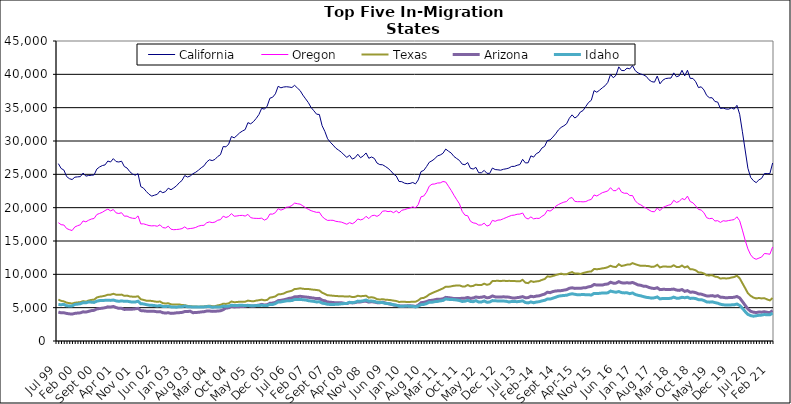
| Category | California | Oregon | Texas | Arizona | Idaho |
|---|---|---|---|---|---|
| Jul 99 | 26605 | 17749 | 6209 | 4339 | 5471 |
| Aug 99 | 25882 | 17447 | 6022 | 4228 | 5444 |
| Sep 99 | 25644 | 17401 | 5941 | 4237 | 5488 |
| Oct 99 | 24669 | 16875 | 5751 | 4134 | 5279 |
| Nov 99 | 24353 | 16701 | 5680 | 4073 | 5260 |
| Dec 99 | 24218 | 16570 | 5619 | 4042 | 5269 |
| Jan 00 | 24574 | 17109 | 5736 | 4142 | 5485 |
| Feb 00 | 24620 | 17295 | 5789 | 4192 | 5530 |
| Mar 00 | 24655 | 17436 | 5826 | 4226 | 5590 |
| Apr 00 | 25195 | 18009 | 5980 | 4375 | 5748 |
| May 00 | 24730 | 17875 | 5897 | 4337 | 5729 |
| Jun 00 | 24825 | 18113 | 6070 | 4444 | 5853 |
| Jul 00 | 24857 | 18294 | 6163 | 4555 | 5824 |
| Aug 00 | 24913 | 18376 | 6199 | 4603 | 5788 |
| Sep 00 | 25792 | 18971 | 6529 | 4804 | 5976 |
| Oct 00 | 26106 | 19135 | 6643 | 4870 | 6058 |
| Nov 00 | 26315 | 19306 | 6705 | 4926 | 6085 |
| Dec 00 | 26415 | 19570 | 6793 | 4991 | 6096 |
| Jan 01 | 26995 | 19781 | 6942 | 5122 | 6119 |
| Feb 01 | 26851 | 19519 | 6948 | 5089 | 6090 |
| Mar 01 | 27352 | 19720 | 7080 | 5180 | 6143 |
| Apr 01 | 26918 | 19221 | 6943 | 5020 | 6020 |
| May 01 | 26848 | 19126 | 6924 | 4899 | 5950 |
| Jun 01 | 26974 | 19241 | 6959 | 4895 | 6019 |
| Jul 01 | 26172 | 18725 | 6778 | 4737 | 5951 |
| Aug 01 | 25943 | 18736 | 6810 | 4757 | 5973 |
| Sep 01 | 25399 | 18514 | 6688 | 4753 | 5895 |
| Oct 01 | 25050 | 18415 | 6650 | 4780 | 5833 |
| Nov 01 | 24873 | 18381 | 6631 | 4826 | 5850 |
| Dec 01 | 25099 | 18765 | 6708 | 4898 | 5969 |
| Jan 02 | 23158 | 17561 | 6261 | 4560 | 5595 |
| Feb 02 | 22926 | 17573 | 6162 | 4531 | 5560 |
| Mar 02 | 22433 | 17452 | 6052 | 4481 | 5458 |
| Apr 02 | 22012 | 17314 | 6046 | 4458 | 5380 |
| May 02 | 21733 | 17267 | 6007 | 4452 | 5358 |
| Jun 02 | 21876 | 17298 | 5933 | 4444 | 5315 |
| Jul 02 | 21997 | 17209 | 5873 | 4383 | 5243 |
| Aug 02 | 22507 | 17436 | 5929 | 4407 | 5315 |
| Sep 02 | 22244 | 17010 | 5672 | 4248 | 5192 |
| Oct 02 | 22406 | 16952 | 5625 | 4191 | 5167 |
| Nov 02 | 22922 | 17223 | 5663 | 4242 | 5221 |
| Dec 02 | 22693 | 16770 | 5499 | 4142 | 5120 |
| Jan 03 | 22964 | 16694 | 5463 | 4166 | 5089 |
| Feb 03 | 23276 | 16727 | 5461 | 4226 | 5077 |
| Mar 03 | 23736 | 16766 | 5486 | 4251 | 5145 |
| Apr 03 | 24079 | 16859 | 5389 | 4289 | 5145 |
| May 03 | 24821 | 17117 | 5378 | 4415 | 5254 |
| Jun 03 | 24592 | 16812 | 5273 | 4426 | 5135 |
| Jul 03 | 24754 | 16875 | 5226 | 4466 | 5124 |
| Aug 03 | 25092 | 16922 | 5181 | 4244 | 5100 |
| Sep 03 | 25316 | 17036 | 5181 | 4279 | 5086 |
| Oct 03 | 25622 | 17228 | 5139 | 4301 | 5110 |
| Nov 03 | 25984 | 17335 | 5175 | 4362 | 5091 |
| Dec 03 | 26269 | 17350 | 5189 | 4396 | 5113 |
| Jan 04 | 26852 | 17734 | 5255 | 4492 | 5152 |
| Feb 04 | 27184 | 17860 | 5301 | 4502 | 5183 |
| Mar 04 | 27062 | 17757 | 5227 | 4443 | 5056 |
| Apr 04 | 27238 | 17840 | 5227 | 4461 | 5104 |
| May 04 | 27671 | 18113 | 5345 | 4493 | 5095 |
| Jun 04 | 27949 | 18201 | 5416 | 4532 | 5103 |
| Jul 04 | 29172 | 18727 | 5597 | 4697 | 5231 |
| Aug 04 | 29122 | 18529 | 5561 | 4945 | 5197 |
| Sep 04 | 29542 | 18678 | 5656 | 4976 | 5237 |
| Oct 04 | 30674 | 19108 | 5922 | 5188 | 5363 |
| Nov 04 | 30472 | 18716 | 5823 | 5106 | 5321 |
| Dec 04 | 30831 | 18755 | 5838 | 5135 | 5312 |
| Jan 05 | 31224 | 18823 | 5906 | 5155 | 5374 |
| Feb 05 | 31495 | 18842 | 5898 | 5168 | 5357 |
| Mar 05 | 31714 | 18738 | 5894 | 5212 | 5313 |
| Apr 05 | 32750 | 18998 | 6060 | 5340 | 5350 |
| May 05 | 32575 | 18504 | 5989 | 5269 | 5276 |
| Jun 05 | 32898 | 18414 | 5954 | 5252 | 5271 |
| Jul 05 | 33384 | 18395 | 6062 | 5322 | 5322 |
| Aug 05 | 33964 | 18381 | 6113 | 5375 | 5316 |
| Sep 05 | 34897 | 18426 | 6206 | 5493 | 5362 |
| Oct 05 | 34780 | 18132 | 6100 | 5408 | 5308 |
| Nov 05 | 35223 | 18332 | 6162 | 5434 | 5314 |
| Dec 05 | 36415 | 19047 | 6508 | 5658 | 5487 |
| Jan 06 | 36567 | 19032 | 6576 | 5688 | 5480 |
| Feb 06 | 37074 | 19257 | 6692 | 5792 | 5616 |
| Mar 06 | 38207 | 19845 | 6993 | 6052 | 5850 |
| Apr 06 | 37976 | 19637 | 7024 | 6101 | 5864 |
| May 06 | 38099 | 19781 | 7114 | 6178 | 5943 |
| Jun 06 | 38141 | 20061 | 7331 | 6276 | 6018 |
| Jul 06 | 38097 | 20111 | 7431 | 6399 | 6046 |
| Aug 06 | 38021 | 20333 | 7542 | 6450 | 6064 |
| Sep 06 | 38349 | 20686 | 7798 | 6627 | 6232 |
| Oct 06 | 37947 | 20591 | 7825 | 6647 | 6216 |
| Nov 06 | 37565 | 20526 | 7907 | 6707 | 6244 |
| Dec 06 | 36884 | 20272 | 7840 | 6648 | 6192 |
| Jan 07 | 36321 | 19984 | 7789 | 6597 | 6151 |
| Feb 07 | 35752 | 19752 | 7799 | 6554 | 6048 |
| Mar 07 | 35025 | 19547 | 7737 | 6487 | 5989 |
| Apr 07 | 34534 | 19412 | 7685 | 6430 | 5937 |
| May 07 | 34022 | 19296 | 7654 | 6353 | 5858 |
| Jun 07 | 33974 | 19318 | 7577 | 6390 | 5886 |
| Jul 07 | 32298 | 18677 | 7250 | 6117 | 5682 |
| Aug 07 | 31436 | 18322 | 7070 | 6034 | 5617 |
| Sep 07 | 30331 | 18087 | 6853 | 5847 | 5500 |
| Oct 07 | 29813 | 18108 | 6839 | 5821 | 5489 |
| Nov 07 | 29384 | 18105 | 6777 | 5769 | 5481 |
| Dec 07 | 28923 | 17949 | 6760 | 5733 | 5499 |
| Jan 08 | 28627 | 17890 | 6721 | 5732 | 5521 |
| Feb 08 | 28328 | 17834 | 6719 | 5749 | 5579 |
| Mar 08 | 27911 | 17680 | 6690 | 5650 | 5614 |
| Apr 08 | 27543 | 17512 | 6656 | 5612 | 5635 |
| May 08 | 27856 | 17754 | 6705 | 5774 | 5798 |
| Jun 08 | 27287 | 17589 | 6593 | 5717 | 5745 |
| Jul 08 | 27495 | 17834 | 6623 | 5761 | 5807 |
| Aug 08 | 28018 | 18309 | 6789 | 5867 | 5982 |
| Sep-08 | 27491 | 18164 | 6708 | 5864 | 5954 |
| Oct 08 | 27771 | 18291 | 6755 | 5942 | 6032 |
| Nov 08 | 28206 | 18706 | 6787 | 5970 | 6150 |
| Dec 08 | 27408 | 18353 | 6505 | 5832 | 5975 |
| Jan 09 | 27601 | 18778 | 6569 | 5890 | 5995 |
| Feb 09 | 27394 | 18863 | 6483 | 5845 | 5936 |
| Mar 09 | 26690 | 18694 | 6273 | 5751 | 5806 |
| Apr 09 | 26461 | 18943 | 6222 | 5735 | 5777 |
| May 09 | 26435 | 19470 | 6272 | 5819 | 5767 |
| Jun 09 | 26187 | 19522 | 6199 | 5700 | 5649 |
| Jul 09 | 25906 | 19408 | 6171 | 5603 | 5617 |
| Aug 09 | 25525 | 19469 | 6128 | 5533 | 5540 |
| Sep 09 | 25050 | 19249 | 6059 | 5405 | 5437 |
| Oct 09 | 24741 | 19529 | 6004 | 5349 | 5369 |
| Nov 09 | 23928 | 19187 | 5854 | 5271 | 5248 |
| Dec 09 | 23899 | 19607 | 5886 | 5261 | 5195 |
| Jan 10 | 23676 | 19703 | 5881 | 5232 | 5234 |
| Feb 10 | 23592 | 19845 | 5850 | 5272 | 5236 |
| Mar 10 | 23634 | 19946 | 5864 | 5278 | 5219 |
| Apr 10 | 23774 | 20134 | 5889 | 5257 | 5201 |
| May 10 | 23567 | 19966 | 5897 | 5172 | 5105 |
| Jun 10 | 24166 | 20464 | 6087 | 5356 | 5237 |
| Jul 10 | 25410 | 21627 | 6417 | 5742 | 5452 |
| Aug 10 | 25586 | 21744 | 6465 | 5797 | 5491 |
| Sep 10 | 26150 | 22314 | 6667 | 5907 | 5609 |
| Oct 10 | 26807 | 23219 | 6986 | 6070 | 5831 |
| Nov 10 | 27033 | 23520 | 7179 | 6100 | 5810 |
| Dec 10 | 27332 | 23551 | 7361 | 6182 | 5898 |
| Jan 11 | 27769 | 23697 | 7525 | 6276 | 5938 |
| Feb 11 | 27898 | 23718 | 7708 | 6267 | 6016 |
| Mar 11 | 28155 | 23921 | 7890 | 6330 | 6081 |
| Apr 11 | 28790 | 23847 | 8146 | 6544 | 6305 |
| May 11 | 28471 | 23215 | 8131 | 6502 | 6248 |
| Jun 11 | 28191 | 22580 | 8199 | 6445 | 6217 |
| Jul 11 | 27678 | 21867 | 8291 | 6368 | 6202 |
| Aug 11 | 27372 | 21203 | 8321 | 6356 | 6146 |
| Sep 11 | 27082 | 20570 | 8341 | 6387 | 6075 |
| Oct 11 | 26528 | 19442 | 8191 | 6402 | 5932 |
| Nov 11 | 26440 | 18872 | 8176 | 6426 | 5968 |
| Dec 11 | 26770 | 18784 | 8401 | 6533 | 6106 |
| Jan 12 | 25901 | 17963 | 8202 | 6390 | 5933 |
| Feb 12 | 25796 | 17718 | 8266 | 6456 | 5900 |
| Mar 12 | 26042 | 17647 | 8456 | 6600 | 6054 |
| Apr 12 | 25239 | 17386 | 8388 | 6534 | 5838 |
| May 12 | 25238 | 17407 | 8401 | 6558 | 5854 |
| Jun 12 | 25593 | 17673 | 8594 | 6669 | 6009 |
| Jul 12 | 25155 | 17237 | 8432 | 6474 | 5817 |
| Aug 12 | 25146 | 17391 | 8536 | 6539 | 5842 |
| Sep 12 | 25942 | 18102 | 8989 | 6759 | 6061 |
| Oct 12 | 25718 | 17953 | 9012 | 6618 | 6027 |
| Nov 12 | 25677 | 18134 | 9032 | 6611 | 6009 |
| Dec 12 | 25619 | 18166 | 8981 | 6601 | 5999 |
| Jan 13 | 25757 | 18344 | 9051 | 6627 | 5989 |
| Feb-13 | 25830 | 18512 | 9001 | 6606 | 5968 |
| Mar-13 | 25940 | 18689 | 9021 | 6577 | 5853 |
| Apr 13 | 26187 | 18844 | 9013 | 6478 | 5925 |
| May 13 | 26192 | 18884 | 9003 | 6431 | 5924 |
| Jun-13 | 26362 | 19013 | 8948 | 6508 | 5896 |
| Jul 13 | 26467 | 19037 | 8958 | 6559 | 5948 |
| Aug 13 | 27253 | 19198 | 9174 | 6655 | 6020 |
| Sep 13 | 26711 | 18501 | 8747 | 6489 | 5775 |
| Oct 13 | 26733 | 18301 | 8681 | 6511 | 5711 |
| Nov 13 | 27767 | 18620 | 8989 | 6709 | 5860 |
| Dec 13 | 27583 | 18320 | 8863 | 6637 | 5740 |
| Jan 14 | 28107 | 18409 | 8939 | 6735 | 5843 |
| Feb-14 | 28313 | 18383 | 8989 | 6779 | 5893 |
| Mar 14 | 28934 | 18696 | 9160 | 6918 | 6015 |
| Apr 14 | 29192 | 18946 | 9291 | 7036 | 6099 |
| May 14 | 30069 | 19603 | 9701 | 7314 | 6304 |
| Jun 14 | 30163 | 19487 | 9641 | 7252 | 6293 |
| Jul-14 | 30587 | 19754 | 9752 | 7415 | 6427 |
| Aug-14 | 31074 | 20201 | 9882 | 7499 | 6557 |
| Sep 14 | 31656 | 20459 | 9997 | 7536 | 6719 |
| Oct 14 | 32037 | 20663 | 10109 | 7555 | 6786 |
| Nov 14 | 32278 | 20825 | 9992 | 7628 | 6831 |
| Dec 14 | 32578 | 20918 | 10006 | 7705 | 6860 |
| Jan 15 | 33414 | 21396 | 10213 | 7906 | 7000 |
| Feb 15 | 33922 | 21518 | 10337 | 7982 | 7083 |
| Mar 15 | 33447 | 20942 | 10122 | 7891 | 7006 |
| Apr-15 | 33731 | 20893 | 10138 | 7906 | 6931 |
| May 15 | 34343 | 20902 | 10053 | 7895 | 6952 |
| Jun-15 | 34572 | 20870 | 10192 | 7973 | 6966 |
| Jul 15 | 35185 | 20916 | 10303 | 8000 | 6949 |
| Aug 15 | 35780 | 21115 | 10399 | 8126 | 6938 |
| Sep 15 | 36109 | 21246 | 10428 | 8207 | 6896 |
| Oct 15 | 37555 | 21908 | 10813 | 8477 | 7140 |
| Nov 15 | 37319 | 21750 | 10763 | 8390 | 7112 |
| Dec 15 | 37624 | 21990 | 10807 | 8395 | 7149 |
| Jan 16 | 37978 | 22248 | 10892 | 8388 | 7201 |
| Feb 16 | 38285 | 22369 | 10951 | 8508 | 7192 |
| Mar 16 | 38792 | 22506 | 11075 | 8547 | 7226 |
| Apr 16 | 39994 | 22999 | 11286 | 8815 | 7487 |
| May 16 | 39488 | 22548 | 11132 | 8673 | 7382 |
| Jun 16 | 39864 | 22556 | 11100 | 8682 | 7315 |
| Jul 16 | 41123 | 22989 | 11516 | 8903 | 7420 |
| Aug 16 | 40573 | 22333 | 11251 | 8731 | 7261 |
| Sep 16 | 40560 | 22162 | 11340 | 8692 | 7216 |
| Oct 16 | 40923 | 22172 | 11456 | 8742 | 7233 |
| Nov 16 | 40817 | 21818 | 11459 | 8685 | 7101 |
| Dec 16 | 41311 | 21815 | 11681 | 8783 | 7203 |
| Jan 17 | 40543 | 21029 | 11524 | 8609 | 6982 |
| Feb 17 | 40218 | 20613 | 11385 | 8416 | 6852 |
| Mar 17 | 40052 | 20425 | 11276 | 8354 | 6775 |
| Apr 17 | 39913 | 20147 | 11297 | 8218 | 6653 |
| May 17 | 39695 | 19910 | 11265 | 8196 | 6552 |
| Jun 17 | 39177 | 19650 | 11225 | 8034 | 6500 |
| Jul 17 | 38901 | 19419 | 11115 | 7923 | 6429 |
| Aug 17 | 38827 | 19389 | 11168 | 7867 | 6479 |
| Sep 17 | 39736 | 19936 | 11426 | 7991 | 6609 |
| Oct 17 | 38576 | 19547 | 11041 | 7708 | 6315 |
| Nov 17 | 39108 | 20013 | 11158 | 7746 | 6381 |
| Dec 17 | 39359 | 20202 | 11185 | 7743 | 6366 |
| Jan 18 | 39420 | 20362 | 11118 | 7736 | 6380 |
| Feb 18 | 39440 | 20476 | 11128 | 7741 | 6407 |
| Mar 18 | 40218 | 21106 | 11362 | 7789 | 6578 |
| Apr 18 | 39637 | 20788 | 11111 | 7642 | 6423 |
| May 18 | 39777 | 20933 | 11097 | 7591 | 6430 |
| Jun 18 | 40602 | 21381 | 11317 | 7721 | 6554 |
| Jul 18 | 39767 | 21189 | 11038 | 7445 | 6489 |
| Aug 18 | 40608 | 21729 | 11200 | 7560 | 6569 |
| Sep 18 | 39395 | 20916 | 10772 | 7318 | 6383 |
| Oct 18 | 39383 | 20724 | 10740 | 7344 | 6429 |
| Nov 18 | 38891 | 20265 | 10605 | 7255 | 6365 |
| Dec 18 | 38013 | 19741 | 10292 | 7069 | 6205 |
| Jan 19 | 38130 | 19643 | 10261 | 7032 | 6203 |
| Feb 19 | 37658 | 19237 | 10132 | 6892 | 6073 |
| Mar 19 | 36831 | 18492 | 9848 | 6766 | 5863 |
| Apr 19 | 36492 | 18349 | 9839 | 6763 | 5827 |
| May 19 | 36481 | 18407 | 9867 | 6809 | 5873 |
| Jun 19 | 35925 | 17998 | 9661 | 6698 | 5761 |
| Jul 19 | 35843 | 18049 | 9598 | 6800 | 5673 |
| Aug 19 | 34870 | 17785 | 9361 | 6577 | 5512 |
| Sep 19 | 34945 | 18038 | 9428 | 6547 | 5437 |
| Oct 19 | 34802 | 17977 | 9385 | 6483 | 5390 |
| Nov 19 | 34775 | 18072 | 9403 | 6511 | 5401 |
| Dec 19 | 34976 | 18140 | 9518 | 6521 | 5419 |
| Jan 20 | 34774 | 18209 | 9594 | 6561 | 5434 |
| Feb 20 | 35352 | 18632 | 9804 | 6682 | 5543 |
| Mar 20 | 34013 | 18041 | 9411 | 6464 | 5330 |
| Apr 20 | 31385 | 16629 | 8666 | 5922 | 4906 |
| May 20 | 28657 | 15123 | 7927 | 5355 | 4419 |
| Jun 20 | 25915 | 13817 | 7164 | 4815 | 3992 |
| Jul 20 | 24545 | 12926 | 6776 | 4457 | 3810 |
| Aug 20 | 24048 | 12443 | 6521 | 4326 | 3720 |
| Sep 20 | 23756 | 12258 | 6386 | 4266 | 3784 |
| Oct 20 | 24166 | 12429 | 6452 | 4347 | 3861 |
| Nov 20 | 24404 | 12597 | 6386 | 4324 | 3883 |
| Dec 20 | 25120 | 13122 | 6420 | 4394 | 3974 |
| Jan 21 | 25111 | 13080 | 6236 | 4304 | 3924 |
| Feb 21 | 25114 | 13015 | 6094 | 4260 | 3930 |
| Mar 21 | 26701 | 14096 | 6455 | 4567 | 4185 |